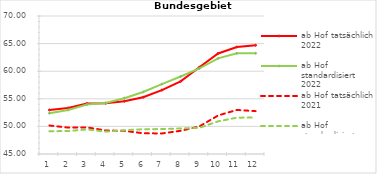
| Category | ab Hof tatsächlich 2022 | ab Hof standardisiert 2022 | ab Hof tatsächlich 2021 | ab Hof standardisiert 2021 |
|---|---|---|---|---|
| 0 | 52.975 | 52.386 | 50.164 | 49.122 |
| 1 | 53.339 | 52.971 | 49.785 | 49.167 |
| 2 | 54.141 | 53.95 | 49.823 | 49.448 |
| 3 | 54.188 | 54.25 | 49.269 | 49.057 |
| 4 | 54.558 | 55.11 | 49.192 | 49.302 |
| 5 | 55.295 | 56.229 | 48.755 | 49.485 |
| 6 | 56.582 | 57.663 | 48.723 | 49.516 |
| 7 | 58.16 | 59.037 | 49.201 | 49.625 |
| 8 | 60.707 | 60.495 | 49.993 | 49.75 |
| 9 | 63.211 | 62.327 | 51.981 | 50.917 |
| 10 | 64.393 | 63.246 | 52.982 | 51.583 |
| 11 | 64.694 | 63.245 | 52.764 | 51.609 |